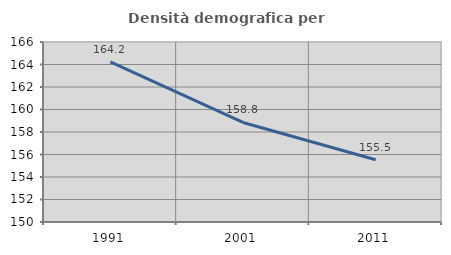
| Category | Densità demografica |
|---|---|
| 1991.0 | 164.241 |
| 2001.0 | 158.847 |
| 2011.0 | 155.537 |